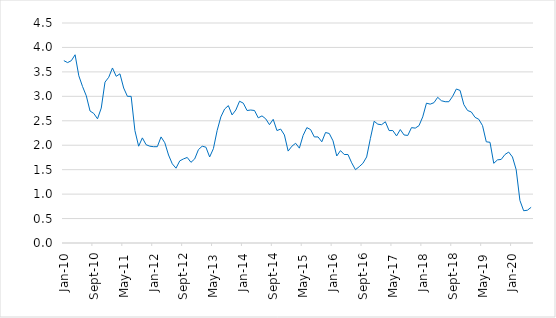
| Category | Series 0 |
|---|---|
| 2010-01-01 | 3.73 |
| 2010-02-01 | 3.69 |
| 2010-03-01 | 3.73 |
| 2010-04-01 | 3.85 |
| 2010-05-01 | 3.42 |
| 2010-06-01 | 3.2 |
| 2010-07-01 | 3.01 |
| 2010-08-01 | 2.7 |
| 2010-09-01 | 2.65 |
| 2010-10-01 | 2.54 |
| 2010-11-01 | 2.76 |
| 2010-12-01 | 3.29 |
| 2011-01-01 | 3.39 |
| 2011-02-01 | 3.58 |
| 2011-03-01 | 3.41 |
| 2011-04-01 | 3.46 |
| 2011-05-01 | 3.17 |
| 2011-06-01 | 3 |
| 2011-07-01 | 3 |
| 2011-08-01 | 2.3 |
| 2011-09-01 | 1.98 |
| 2011-10-01 | 2.15 |
| 2011-11-01 | 2.01 |
| 2011-12-01 | 1.98 |
| 2012-01-01 | 1.97 |
| 2012-02-01 | 1.97 |
| 2012-03-01 | 2.17 |
| 2012-04-01 | 2.05 |
| 2012-05-01 | 1.8 |
| 2012-06-01 | 1.62 |
| 2012-07-01 | 1.53 |
| 2012-08-01 | 1.68 |
| 2012-09-01 | 1.72 |
| 2012-10-01 | 1.75 |
| 2012-11-01 | 1.65 |
| 2012-12-01 | 1.72 |
| 2013-01-01 | 1.91 |
| 2013-02-01 | 1.98 |
| 2013-03-01 | 1.96 |
| 2013-04-01 | 1.76 |
| 2013-05-01 | 1.93 |
| 2013-06-01 | 2.3 |
| 2013-07-01 | 2.58 |
| 2013-08-01 | 2.74 |
| 2013-09-01 | 2.81 |
| 2013-10-01 | 2.62 |
| 2013-11-01 | 2.72 |
| 2013-12-01 | 2.9 |
| 2014-01-01 | 2.86 |
| 2014-02-01 | 2.71 |
| 2014-03-01 | 2.72 |
| 2014-04-01 | 2.71 |
| 2014-05-01 | 2.56 |
| 2014-06-01 | 2.6 |
| 2014-07-01 | 2.54 |
| 2014-08-01 | 2.42 |
| 2014-09-01 | 2.53 |
| 2014-10-01 | 2.3 |
| 2014-11-01 | 2.33 |
| 2014-12-01 | 2.21 |
| 2015-01-01 | 1.88 |
| 2015-02-01 | 1.98 |
| 2015-03-01 | 2.04 |
| 2015-04-01 | 1.94 |
| 2015-05-01 | 2.2 |
| 2015-06-01 | 2.36 |
| 2015-07-01 | 2.32 |
| 2015-08-01 | 2.17 |
| 2015-09-01 | 2.17 |
| 2015-10-01 | 2.07 |
| 2015-11-01 | 2.26 |
| 2015-12-01 | 2.24 |
| 2016-01-01 | 2.09 |
| 2016-02-01 | 1.78 |
| 2016-03-01 | 1.89 |
| 2016-04-01 | 1.81 |
| 2016-05-01 | 1.81 |
| 2016-06-01 | 1.64 |
| 2016-07-01 | 1.5 |
| 2016-08-01 | 1.56 |
| 2016-09-01 | 1.63 |
| 2016-10-01 | 1.76 |
| 2016-11-01 | 2.14 |
| 2016-12-01 | 2.49 |
| 2017-01-01 | 2.43 |
| 2017-02-01 | 2.42 |
| 2017-03-01 | 2.48 |
| 2017-04-01 | 2.3 |
| 2017-05-01 | 2.3 |
| 2017-06-01 | 2.19 |
| 2017-07-01 | 2.32 |
| 2017-08-01 | 2.21 |
| 2017-09-01 | 2.2 |
| 2017-10-01 | 2.36 |
| 2017-11-01 | 2.35 |
| 2017-12-01 | 2.4 |
| 2018-01-01 | 2.58 |
| 2018-02-01 | 2.86 |
| 2018-03-01 | 2.84 |
| 2018-04-01 | 2.87 |
| 2018-05-01 | 2.98 |
| 2018-06-01 | 2.91 |
| 2018-07-01 | 2.89 |
| 2018-08-01 | 2.89 |
| 2018-09-01 | 3 |
| 2018-10-01 | 3.15 |
| 2018-11-01 | 3.12 |
| 2018-12-01 | 2.83 |
| 2019-01-01 | 2.71 |
| 2019-02-01 | 2.68 |
| 2019-03-01 | 2.57 |
| 2019-04-01 | 2.53 |
| 2019-05-01 | 2.4 |
| 2019-06-01 | 2.07 |
| 2019-07-01 | 2.06 |
| 2019-08-01 | 1.63 |
| 2019-09-01 | 1.7 |
| 2019-10-01 | 1.71 |
| 2019-11-01 | 1.81 |
| 2019-12-01 | 1.86 |
| 2020-01-01 | 1.76 |
| 2020-02-01 | 1.5 |
| 2020-03-01 | 0.87 |
| 2020-04-01 | 0.66 |
| 2020-05-01 | 0.67 |
| 2020-06-01 | 0.73 |